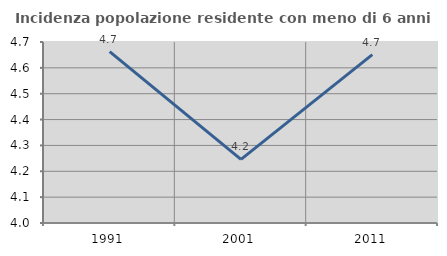
| Category | Incidenza popolazione residente con meno di 6 anni |
|---|---|
| 1991.0 | 4.663 |
| 2001.0 | 4.246 |
| 2011.0 | 4.651 |